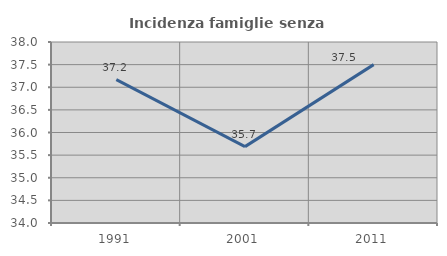
| Category | Incidenza famiglie senza nuclei |
|---|---|
| 1991.0 | 37.168 |
| 2001.0 | 35.688 |
| 2011.0 | 37.5 |